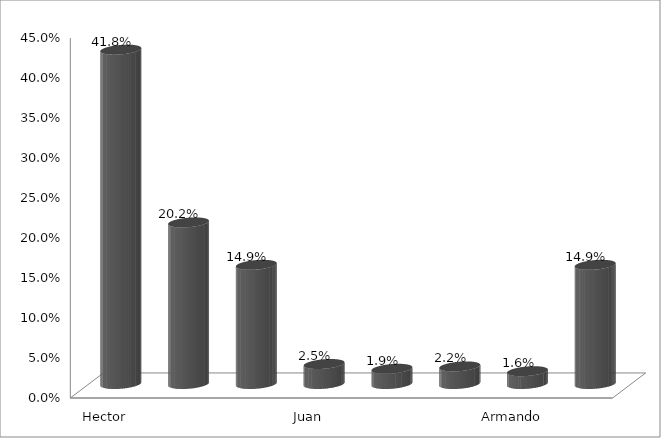
| Category | Series 0 |
|---|---|
| Hector Yunes Landa  | 0.418 |
| Miguel Angel Yunes Linares  | 0.202 |
| Cuitáhuac García Jimenez  | 0.149 |
| Juan Bueno Torio  | 0.025 |
| Alba Leonila Méndez  | 0.019 |
| Victor A Vázquez Cuevas "PIPO" | 0.022 |
| Armando Méndez de la Luz  | 0.016 |
| No respondio | 0.149 |